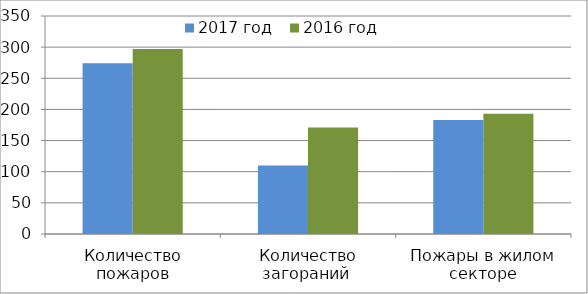
| Category | 2017 год | 2016 год |
|---|---|---|
| Количество пожаров | 274 | 297 |
| Количество загораний  | 110 | 171 |
| Пожары в жилом секторе | 183 | 193 |